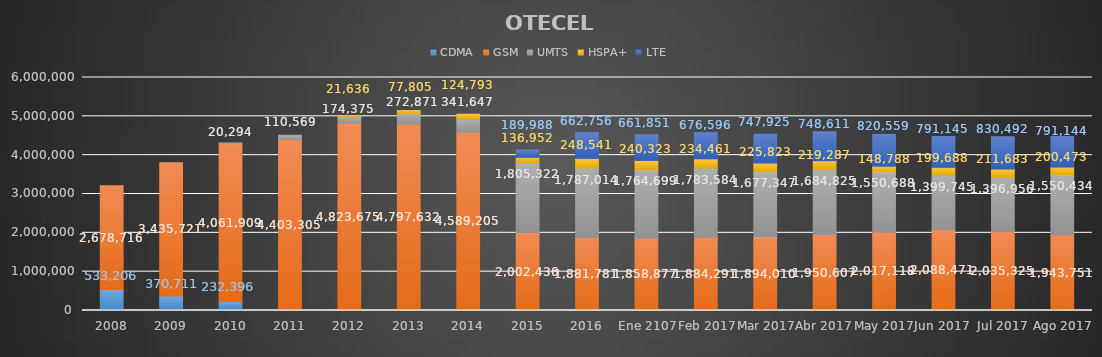
| Category | CDMA | GSM | UMTS | HSPA+ | LTE |
|---|---|---|---|---|---|
| 2008 | 533206 | 2678716 | 0 | 0 | 0 |
| 2009 | 370711 | 3435721 | 0 | 0 | 0 |
| 2010 | 232396 | 4061909 | 20294 | 0 | 0 |
| 2011 | 0 | 4403305 | 110569 | 0 | 0 |
| 2012 | 0 | 4823675 | 174375 | 21636 | 0 |
| 2013 | 0 | 4797632 | 272871 | 77805 | 0 |
| 2014 | 0 | 4589205 | 341647 | 124793 | 0 |
| 2015 | 0 | 2002436 | 1805322 | 136952 | 189988 |
| 2016 | 0 | 1881781 | 1787014 | 248541 | 662756 |
| Ene 2107 | 0 | 1858877 | 1764699 | 240323 | 661851 |
| Feb 2017 | 0 | 1884291 | 1783584 | 234461 | 676596 |
| Mar 2017 | 0 | 1894010 | 1677347 | 225823 | 747925 |
| Abr 2017 | 0 | 1950607 | 1684825 | 219287 | 748611 |
| May 2017 | 0 | 2017118 | 1550688 | 148788 | 820559 |
| Jun 2017 | 0 | 2088471 | 1399745 | 199688 | 791145 |
| Jul 2017 | 0 | 2035325 | 1396956 | 211683 | 830492 |
| Ago 2017 | 0 | 1943751 | 1550434 | 200473 | 791144 |